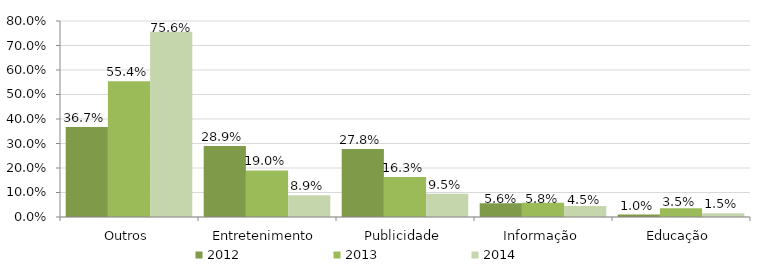
| Category | 2012 | 2013 | 2014 |
|---|---|---|---|
| Outros | 0.367 | 0.554 | 0.756 |
| Entretenimento | 0.289 | 0.19 | 0.089 |
| Publicidade | 0.278 | 0.163 | 0.095 |
| Informação | 0.056 | 0.058 | 0.045 |
| Educação | 0.01 | 0.035 | 0.015 |